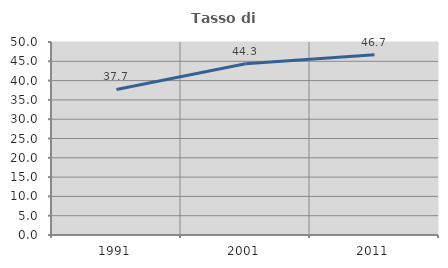
| Category | Tasso di occupazione   |
|---|---|
| 1991.0 | 37.705 |
| 2001.0 | 44.346 |
| 2011.0 | 46.703 |